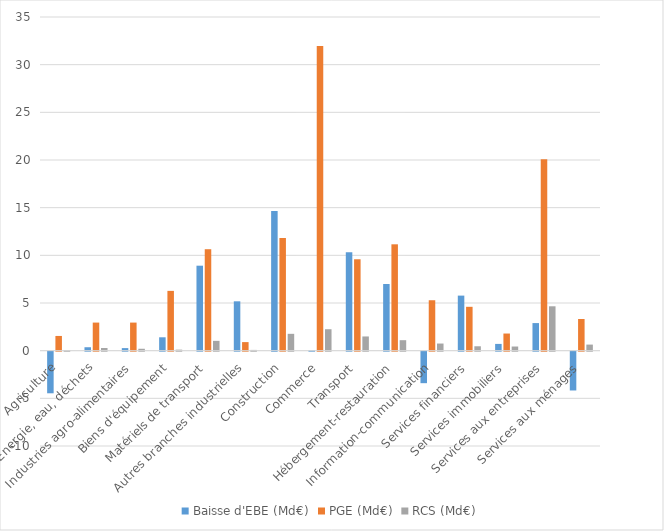
| Category | Baisse d'EBE (Md€) | PGE (Md€) | RCS (Md€) |
|---|---|---|---|
| Agriculture | -4.366 | 1.543 | 0.056 |
| Energie, eau, déchets | 0.36 | 2.946 | 0.281 |
| Industries agro-alimentaires | 0.269 | 2.946 | 0.199 |
| Biens d'équipement | 1.403 | 6.272 | 0.106 |
| Matériels de transport | 8.914 | 10.642 | 1.029 |
| Autres branches industrielles | 5.177 | 0.898 | 0.078 |
| Construction | 14.638 | 11.818 | 1.766 |
| Commerce | 0.052 | 31.949 | 2.249 |
| Transport | 10.323 | 9.589 | 1.49 |
| Hébergement-restauration | 6.991 | 11.156 | 1.099 |
| Information-communication | -3.305 | 5.289 | 0.749 |
| Services financiers | 5.775 | 4.601 | 0.462 |
| Services immobiliers | 0.709 | 1.798 | 0.435 |
| Services aux entreprises | 2.894 | 20.082 | 4.655 |
| Services aux ménages | -4.071 | 3.324 | 0.637 |